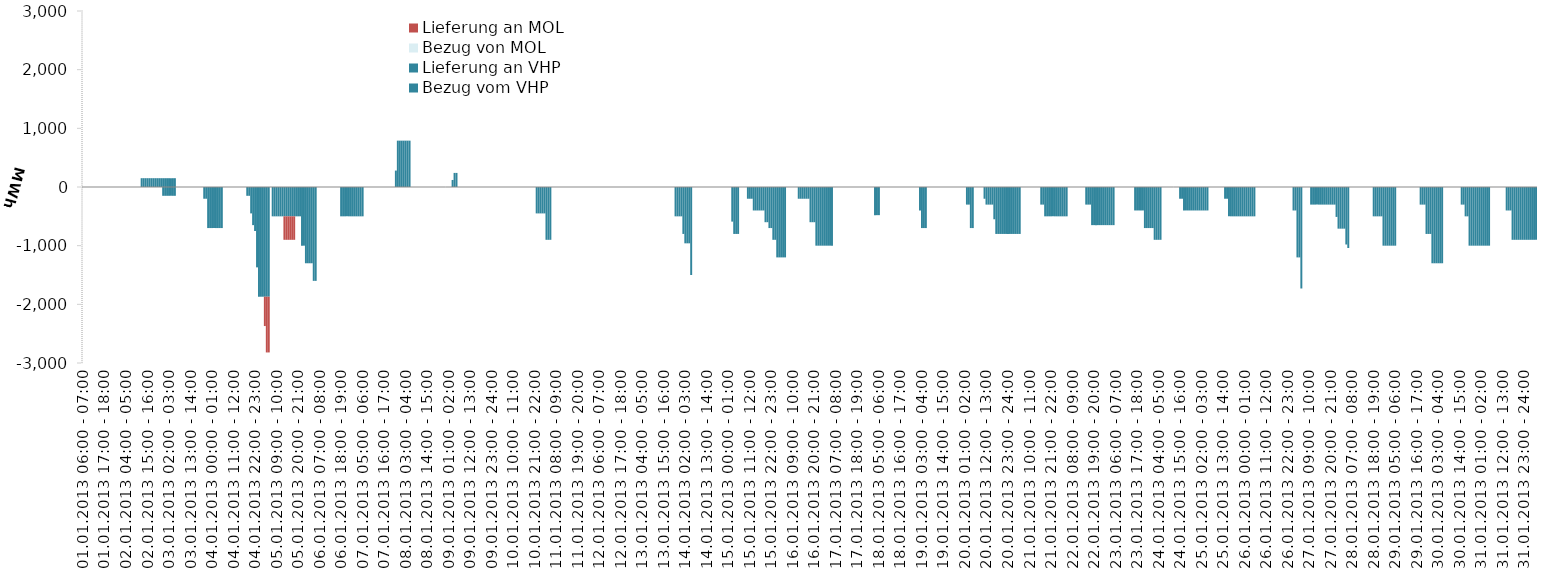
| Category | Bezug vom VHP | Lieferung an VHP | Bezug von MOL | Lieferung an MOL |
|---|---|---|---|---|
| 01.01.2013 06:00 - 07:00 | 0 | 0 | 0 | 0 |
| 01.01.2013 07:00 - 08:00 | 0 | 0 | 0 | 0 |
| 01.01.2013 08:00 - 09:00 | 0 | 0 | 0 | 0 |
| 01.01.2013 09:00 - 10:00 | 0 | 0 | 0 | 0 |
| 01.01.2013 10:00 - 11:00 | 0 | 0 | 0 | 0 |
| 01.01.2013 11:00 - 12:00 | 0 | 0 | 0 | 0 |
| 01.01.2013 12:00 - 13:00 | 0 | 0 | 0 | 0 |
| 01.01.2013 13:00 - 14:00 | 0 | 0 | 0 | 0 |
| 01.01.2013 14:00 - 15:00 | 0 | 0 | 0 | 0 |
| 01.01.2013 15:00 - 16:00 | 0 | 0 | 0 | 0 |
| 01.01.2013 16:00 - 17:00 | 0 | 0 | 0 | 0 |
| 01.01.2013 17:00 - 18:00 | 0 | 0 | 0 | 0 |
| 01.01.2013 18:00 - 19:00 | 0 | 0 | 0 | 0 |
| 01.01.2013 19:00 - 20:00 | 0 | 0 | 0 | 0 |
| 01.01.2013 20:00 - 21:00 | 0 | 0 | 0 | 0 |
| 01.01.2013 21:00 - 22:00 | 0 | 0 | 0 | 0 |
| 01.01.2013 22:00 - 23:00 | 0 | 0 | 0 | 0 |
| 01.01.2013 23:00 - 24:00 | 0 | 0 | 0 | 0 |
| 02.01.2013 00:00 - 01:00 | 0 | 0 | 0 | 0 |
| 02.01.2013 01:00 - 02:00 | 0 | 0 | 0 | 0 |
| 02.01.2013 02:00 - 03:00 | 0 | 0 | 0 | 0 |
| 02.01.2013 03:00 - 04:00 | 0 | 0 | 0 | 0 |
| 02.01.2013 04:00 - 05:00 | 0 | 0 | 0 | 0 |
| 02.01.2013 05:00 - 06:00 | 0 | 0 | 0 | 0 |
| 02.01.2013 06:00 - 07:00 | 0 | 0 | 0 | 0 |
| 02.01.2013 07:00 - 08:00 | 0 | 0 | 0 | 0 |
| 02.01.2013 08:00 - 09:00 | 0 | 0 | 0 | 0 |
| 02.01.2013 09:00 - 10:00 | 0 | 0 | 0 | 0 |
| 02.01.2013 10:00 - 11:00 | 0 | 0 | 0 | 0 |
| 02.01.2013 11:00 - 12:00 | 0 | 0 | 0 | 0 |
| 02.01.2013 12:00 - 13:00 | 150 | 0 | 0 | 0 |
| 02.01.2013 13:00 - 14:00 | 150 | 0 | 0 | 0 |
| 02.01.2013 14:00 - 15:00 | 150 | 0 | 0 | 0 |
| 02.01.2013 15:00 - 16:00 | 150 | 0 | 0 | 0 |
| 02.01.2013 16:00 - 17:00 | 150 | 0 | 0 | 0 |
| 02.01.2013 17:00 - 18:00 | 150 | 0 | 0 | 0 |
| 02.01.2013 18:00 - 19:00 | 150 | 0 | 0 | 0 |
| 02.01.2013 19:00 - 20:00 | 150 | 0 | 0 | 0 |
| 02.01.2013 20:00 - 21:00 | 150 | 0 | 0 | 0 |
| 02.01.2013 21:00 - 22:00 | 150 | 0 | 0 | 0 |
| 02.01.2013 22:00 - 23:00 | 150 | 0 | 0 | 0 |
| 02.01.2013 23:00 - 24:00 | 150 | -150 | 0 | 0 |
| 03.01.2013 00:00 - 01:00 | 150 | -150 | 0 | 0 |
| 03.01.2013 01:00 - 02:00 | 150 | -150 | 0 | 0 |
| 03.01.2013 02:00 - 03:00 | 150 | -150 | 0 | 0 |
| 03.01.2013 03:00 - 04:00 | 150 | -150 | 0 | 0 |
| 03.01.2013 04:00 - 05:00 | 150 | -150 | 0 | 0 |
| 03.01.2013 05:00 - 06:00 | 150 | -150 | 0 | 0 |
| 03.01.2013 06:00 - 07:00 | 0 | 0 | 0 | 0 |
| 03.01.2013 07:00 - 08:00 | 0 | 0 | 0 | 0 |
| 03.01.2013 08:00 - 09:00 | 0 | 0 | 0 | 0 |
| 03.01.2013 09:00 - 10:00 | 0 | 0 | 0 | 0 |
| 03.01.2013 10:00 - 11:00 | 0 | 0 | 0 | 0 |
| 03.01.2013 11:00 - 12:00 | 0 | 0 | 0 | 0 |
| 03.01.2013 12:00 - 13:00 | 0 | 0 | 0 | 0 |
| 03.01.2013 13:00 - 14:00 | 0 | 0 | 0 | 0 |
| 03.01.2013 14:00 - 15:00 | 0 | 0 | 0 | 0 |
| 03.01.2013 15:00 - 16:00 | 0 | 0 | 0 | 0 |
| 03.01.2013 16:00 - 17:00 | 0 | 0 | 0 | 0 |
| 03.01.2013 17:00 - 18:00 | 0 | 0 | 0 | 0 |
| 03.01.2013 18:00 - 19:00 | 0 | 0 | 0 | 0 |
| 03.01.2013 19:00 - 20:00 | 0 | 0 | 0 | 0 |
| 03.01.2013 20:00 - 21:00 | 0 | -200 | 0 | 0 |
| 03.01.2013 21:00 - 22:00 | 0 | -200 | 0 | 0 |
| 03.01.2013 22:00 - 23:00 | 0 | -700 | 0 | 0 |
| 03.01.2013 23:00 - 24:00 | 0 | -700 | 0 | 0 |
| 04.01.2013 00:00 - 01:00 | 0 | -700 | 0 | 0 |
| 04.01.2013 01:00 - 02:00 | 0 | -700 | 0 | 0 |
| 04.01.2013 02:00 - 03:00 | 0 | -700 | 0 | 0 |
| 04.01.2013 03:00 - 04:00 | 0 | -700 | 0 | 0 |
| 04.01.2013 04:00 - 05:00 | 0 | -700 | 0 | 0 |
| 04.01.2013 05:00 - 06:00 | 0 | -700 | 0 | 0 |
| 04.01.2013 06:00 - 07:00 | 0 | 0 | 0 | 0 |
| 04.01.2013 07:00 - 08:00 | 0 | 0 | 0 | 0 |
| 04.01.2013 08:00 - 09:00 | 0 | 0 | 0 | 0 |
| 04.01.2013 09:00 - 10:00 | 0 | 0 | 0 | 0 |
| 04.01.2013 10:00 - 11:00 | 0 | 0 | 0 | 0 |
| 04.01.2013 11:00 - 12:00 | 0 | 0 | 0 | 0 |
| 04.01.2013 12:00 - 13:00 | 0 | 0 | 0 | 0 |
| 04.01.2013 13:00 - 14:00 | 0 | 0 | 0 | 0 |
| 04.01.2013 14:00 - 15:00 | 0 | 0 | 0 | 0 |
| 04.01.2013 15:00 - 16:00 | 0 | 0 | 0 | 0 |
| 04.01.2013 16:00 - 17:00 | 0 | 0 | 0 | 0 |
| 04.01.2013 17:00 - 18:00 | 0 | 0 | 0 | 0 |
| 04.01.2013 18:00 - 19:00 | 0 | -150 | 0 | 0 |
| 04.01.2013 19:00 - 20:00 | 0 | -150 | 0 | 0 |
| 04.01.2013 20:00 - 21:00 | 0 | -450 | 0 | 0 |
| 04.01.2013 21:00 - 22:00 | 0 | -650 | 0 | 0 |
| 04.01.2013 22:00 - 23:00 | 0 | -750 | 0 | 0 |
| 04.01.2013 23:00 - 24:00 | 0 | -1370 | 0 | 0 |
| 05.01.2013 00:00 - 01:00 | 0 | -1870 | 0 | 0 |
| 05.01.2013 01:00 - 02:00 | 0 | -1870 | 0 | 0 |
| 05.01.2013 02:00 - 03:00 | 0 | -1870 | 0 | 0 |
| 05.01.2013 03:00 - 04:00 | 0 | -1870 | 0 | -500 |
| 05.01.2013 04:00 - 05:00 | 0 | -1870 | 0 | -950 |
| 05.01.2013 05:00 - 06:00 | 0 | -1870 | 0 | -950 |
| 05.01.2013 06:00 - 07:00 | 0 | 0 | 0 | 0 |
| 05.01.2013 07:00 - 08:00 | 0 | -500 | 0 | 0 |
| 05.01.2013 08:00 - 09:00 | 0 | -500 | 0 | 0 |
| 05.01.2013 09:00 - 10:00 | 0 | -500 | 0 | 0 |
| 05.01.2013 10:00 - 11:00 | 0 | -500 | 0 | 0 |
| 05.01.2013 11:00 - 12:00 | 0 | -500 | 0 | 0 |
| 05.01.2013 12:00 - 13:00 | 0 | -500 | 0 | 0 |
| 05.01.2013 13:00 - 14:00 | 0 | -500 | 0 | -400 |
| 05.01.2013 14:00 - 15:00 | 0 | -500 | 0 | -400 |
| 05.01.2013 15:00 - 16:00 | 0 | -500 | 0 | -400 |
| 05.01.2013 16:00 - 17:00 | 0 | -500 | 0 | -400 |
| 05.01.2013 17:00 - 18:00 | 0 | -500 | 0 | -400 |
| 05.01.2013 18:00 - 19:00 | 0 | -500 | 0 | -400 |
| 05.01.2013 19:00 - 20:00 | 0 | -500 | 0 | 0 |
| 05.01.2013 20:00 - 21:00 | 0 | -500 | 0 | 0 |
| 05.01.2013 21:00 - 22:00 | 0 | -500 | 0 | 0 |
| 05.01.2013 22:00 - 23:00 | 0 | -1000 | 0 | 0 |
| 05.01.2013 23:00 - 24:00 | 0 | -1000 | 0 | 0 |
| 06.01.2013 00:00 - 01:00 | 0 | -1300 | 0 | 0 |
| 06.01.2013 01:00 - 02:00 | 0 | -1300 | 0 | 0 |
| 06.01.2013 02:00 - 03:00 | 0 | -1300 | 0 | 0 |
| 06.01.2013 03:00 - 04:00 | 0 | -1300 | 0 | 0 |
| 06.01.2013 04:00 - 05:00 | 0 | -1600 | 0 | 0 |
| 06.01.2013 05:00 - 06:00 | 0 | -1600 | 0 | 0 |
| 06.01.2013 06:00 - 07:00 | 0 | 0 | 0 | 0 |
| 06.01.2013 07:00 - 08:00 | 0 | 0 | 0 | 0 |
| 06.01.2013 08:00 - 09:00 | 0 | 0 | 0 | 0 |
| 06.01.2013 09:00 - 10:00 | 0 | 0 | 0 | 0 |
| 06.01.2013 10:00 - 11:00 | 0 | 0 | 0 | 0 |
| 06.01.2013 11:00 - 12:00 | 0 | 0 | 0 | 0 |
| 06.01.2013 12:00 - 13:00 | 0 | 0 | 0 | 0 |
| 06.01.2013 13:00 - 14:00 | 0 | 0 | 0 | 0 |
| 06.01.2013 14:00 - 15:00 | 0 | 0 | 0 | 0 |
| 06.01.2013 15:00 - 16:00 | 0 | 0 | 0 | 0 |
| 06.01.2013 16:00 - 17:00 | 0 | 0 | 0 | 0 |
| 06.01.2013 17:00 - 18:00 | 0 | 0 | 0 | 0 |
| 06.01.2013 18:00 - 19:00 | 0 | -500 | 0 | 0 |
| 06.01.2013 19:00 - 20:00 | 0 | -500 | 0 | 0 |
| 06.01.2013 20:00 - 21:00 | 0 | -500 | 0 | 0 |
| 06.01.2013 21:00 - 22:00 | 0 | -500 | 0 | 0 |
| 06.01.2013 22:00 - 23:00 | 0 | -500 | 0 | 0 |
| 06.01.2013 23:00 - 24:00 | 0 | -500 | 0 | 0 |
| 07.01.2013 00:00 - 01:00 | 0 | -500 | 0 | 0 |
| 07.01.2013 01:00 - 02:00 | 0 | -500 | 0 | 0 |
| 07.01.2013 02:00 - 03:00 | 0 | -500 | 0 | 0 |
| 07.01.2013 03:00 - 04:00 | 0 | -500 | 0 | 0 |
| 07.01.2013 04:00 - 05:00 | 0 | -500 | 0 | 0 |
| 07.01.2013 05:00 - 06:00 | 0 | -500 | 0 | 0 |
| 07.01.2013 06:00 - 07:00 | 0 | 0 | 0 | 0 |
| 07.01.2013 07:00 - 08:00 | 0 | 0 | 0 | 0 |
| 07.01.2013 08:00 - 09:00 | 0 | 0 | 0 | 0 |
| 07.01.2013 09:00 - 10:00 | 0 | 0 | 0 | 0 |
| 07.01.2013 10:00 - 11:00 | 0 | 0 | 0 | 0 |
| 07.01.2013 11:00 - 12:00 | 0 | 0 | 0 | 0 |
| 07.01.2013 12:00 - 13:00 | 0 | 0 | 0 | 0 |
| 07.01.2013 13:00 - 14:00 | 0 | 0 | 0 | 0 |
| 07.01.2013 14:00 - 15:00 | 0 | 0 | 0 | 0 |
| 07.01.2013 15:00 - 16:00 | 0 | 0 | 0 | 0 |
| 07.01.2013 16:00 - 17:00 | 0 | 0 | 0 | 0 |
| 07.01.2013 17:00 - 18:00 | 0 | 0 | 0 | 0 |
| 07.01.2013 18:00 - 19:00 | 0 | 0 | 0 | 0 |
| 07.01.2013 19:00 - 20:00 | 0 | 0 | 0 | 0 |
| 07.01.2013 20:00 - 21:00 | 0 | 0 | 0 | 0 |
| 07.01.2013 21:00 - 22:00 | 0 | 0 | 0 | 0 |
| 07.01.2013 22:00 - 23:00 | 280 | 0 | 0 | 0 |
| 07.01.2013 23:00 - 24:00 | 790 | 0 | 0 | 0 |
| 08.01.2013 00:00 - 01:00 | 790 | 0 | 0 | 0 |
| 08.01.2013 01:00 - 02:00 | 790 | 0 | 0 | 0 |
| 08.01.2013 02:00 - 03:00 | 790 | 0 | 0 | 0 |
| 08.01.2013 03:00 - 04:00 | 790 | 0 | 0 | 0 |
| 08.01.2013 04:00 - 05:00 | 790 | 0 | 0 | 0 |
| 08.01.2013 05:00 - 06:00 | 790 | 0 | 0 | 0 |
| 08.01.2013 06:00 - 07:00 | 0 | 0 | 0 | 0 |
| 08.01.2013 07:00 - 08:00 | 0 | 0 | 0 | 0 |
| 08.01.2013 08:00 - 09:00 | 0 | 0 | 0 | 0 |
| 08.01.2013 09:00 - 10:00 | 0 | 0 | 0 | 0 |
| 08.01.2013 10:00 - 11:00 | 0 | 0 | 0 | 0 |
| 08.01.2013 11:00 - 12:00 | 0 | 0 | 0 | 0 |
| 08.01.2013 12:00 - 13:00 | 0 | 0 | 0 | 0 |
| 08.01.2013 13:00 - 14:00 | 0 | 0 | 0 | 0 |
| 08.01.2013 14:00 - 15:00 | 0 | 0 | 0 | 0 |
| 08.01.2013 15:00 - 16:00 | 0 | 0 | 0 | 0 |
| 08.01.2013 16:00 - 17:00 | 0 | 0 | 0 | 0 |
| 08.01.2013 17:00 - 18:00 | 0 | 0 | 0 | 0 |
| 08.01.2013 18:00 - 19:00 | 0 | 0 | 0 | 0 |
| 08.01.2013 19:00 - 20:00 | 0 | 0 | 0 | 0 |
| 08.01.2013 20:00 - 21:00 | 0 | 0 | 0 | 0 |
| 08.01.2013 21:00 - 22:00 | 0 | 0 | 0 | 0 |
| 08.01.2013 22:00 - 23:00 | 0 | 0 | 0 | 0 |
| 08.01.2013 23:00 - 24:00 | 0 | 0 | 0 | 0 |
| 09.01.2013 00:00 - 01:00 | 0 | 0 | 0 | 0 |
| 09.01.2013 01:00 - 02:00 | 0 | 0 | 0 | 0 |
| 09.01.2013 02:00 - 03:00 | 0 | 0 | 0 | 0 |
| 09.01.2013 03:00 - 04:00 | 120 | 0 | 0 | 0 |
| 09.01.2013 04:00 - 05:00 | 240 | 0 | 0 | 0 |
| 09.01.2013 05:00 - 06:00 | 240 | 0 | 0 | 0 |
| 09.01.2013 06:00 - 07:00 | 0 | 0 | 0 | 0 |
| 09.01.2013 07:00 - 08:00 | 0 | 0 | 0 | 0 |
| 09.01.2013 08:00 - 09:00 | 0 | 0 | 0 | 0 |
| 09.01.2013 09:00 - 10:00 | 0 | 0 | 0 | 0 |
| 09.01.2013 10:00 - 11:00 | 0 | 0 | 0 | 0 |
| 09.01.2013 11:00 - 12:00 | 0 | 0 | 0 | 0 |
| 09.01.2013 12:00 - 13:00 | 0 | 0 | 0 | 0 |
| 09.01.2013 13:00 - 14:00 | 0 | 0 | 0 | 0 |
| 09.01.2013 14:00 - 15:00 | 0 | 0 | 0 | 0 |
| 09.01.2013 15:00 - 16:00 | 0 | 0 | 0 | 0 |
| 09.01.2013 16:00 - 17:00 | 0 | 0 | 0 | 0 |
| 09.01.2013 17:00 - 18:00 | 0 | 0 | 0 | 0 |
| 09.01.2013 18:00 - 19:00 | 0 | 0 | 0 | 0 |
| 09.01.2013 19:00 - 20:00 | 0 | 0 | 0 | 0 |
| 09.01.2013 20:00 - 21:00 | 0 | 0 | 0 | 0 |
| 09.01.2013 21:00 - 22:00 | 0 | 0 | 0 | 0 |
| 09.01.2013 22:00 - 23:00 | 0 | 0 | 0 | 0 |
| 09.01.2013 23:00 - 24:00 | 0 | 0 | 0 | 0 |
| 10.01.2013 00:00 - 01:00 | 0 | 0 | 0 | 0 |
| 10.01.2013 01:00 - 02:00 | 0 | 0 | 0 | 0 |
| 10.01.2013 02:00 - 03:00 | 0 | 0 | 0 | 0 |
| 10.01.2013 03:00 - 04:00 | 0 | 0 | 0 | 0 |
| 10.01.2013 04:00 - 05:00 | 0 | 0 | 0 | 0 |
| 10.01.2013 05:00 - 06:00 | 0 | 0 | 0 | 0 |
| 10.01.2013 06:00 - 07:00 | 0 | 0 | 0 | 0 |
| 10.01.2013 07:00 - 08:00 | 0 | 0 | 0 | 0 |
| 10.01.2013 08:00 - 09:00 | 0 | 0 | 0 | 0 |
| 10.01.2013 09:00 - 10:00 | 0 | 0 | 0 | 0 |
| 10.01.2013 10:00 - 11:00 | 0 | 0 | 0 | 0 |
| 10.01.2013 11:00 - 12:00 | 0 | 0 | 0 | 0 |
| 10.01.2013 12:00 - 13:00 | 0 | 0 | 0 | 0 |
| 10.01.2013 13:00 - 14:00 | 0 | 0 | 0 | 0 |
| 10.01.2013 14:00 - 15:00 | 0 | 0 | 0 | 0 |
| 10.01.2013 15:00 - 16:00 | 0 | 0 | 0 | 0 |
| 10.01.2013 16:00 - 17:00 | 0 | 0 | 0 | 0 |
| 10.01.2013 17:00 - 18:00 | 0 | 0 | 0 | 0 |
| 10.01.2013 18:00 - 19:00 | 0 | 0 | 0 | 0 |
| 10.01.2013 19:00 - 20:00 | 0 | 0 | 0 | 0 |
| 10.01.2013 20:00 - 21:00 | 0 | 0 | 0 | 0 |
| 10.01.2013 21:00 - 22:00 | 0 | 0 | 0 | 0 |
| 10.01.2013 22:00 - 23:00 | 0 | -450 | 0 | 0 |
| 10.01.2013 23:00 - 24:00 | 0 | -450 | 0 | 0 |
| 11.01.2013 00:00 - 01:00 | 0 | -450 | 0 | 0 |
| 11.01.2013 01:00 - 02:00 | 0 | -450 | 0 | 0 |
| 11.01.2013 02:00 - 03:00 | 0 | -450 | 0 | 0 |
| 11.01.2013 03:00 - 04:00 | 0 | -900 | 0 | 0 |
| 11.01.2013 04:00 - 05:00 | 0 | -900 | 0 | 0 |
| 11.01.2013 05:00 - 06:00 | 0 | -900 | 0 | 0 |
| 11.01.2013 06:00 - 07:00 | 0 | 0 | 0 | 0 |
| 11.01.2013 07:00 - 08:00 | 0 | 0 | 0 | 0 |
| 11.01.2013 08:00 - 09:00 | 0 | 0 | 0 | 0 |
| 11.01.2013 09:00 - 10:00 | 0 | 0 | 0 | 0 |
| 11.01.2013 10:00 - 11:00 | 0 | 0 | 0 | 0 |
| 11.01.2013 11:00 - 12:00 | 0 | 0 | 0 | 0 |
| 11.01.2013 12:00 - 13:00 | 0 | 0 | 0 | 0 |
| 11.01.2013 13:00 - 14:00 | 0 | 0 | 0 | 0 |
| 11.01.2013 14:00 - 15:00 | 0 | 0 | 0 | 0 |
| 11.01.2013 15:00 - 16:00 | 0 | 0 | 0 | 0 |
| 11.01.2013 16:00 - 17:00 | 0 | 0 | 0 | 0 |
| 11.01.2013 17:00 - 18:00 | 0 | 0 | 0 | 0 |
| 11.01.2013 18:00 - 19:00 | 0 | 0 | 0 | 0 |
| 11.01.2013 19:00 - 20:00 | 0 | 0 | 0 | 0 |
| 11.01.2013 20:00 - 21:00 | 0 | 0 | 0 | 0 |
| 11.01.2013 21:00 - 22:00 | 0 | 0 | 0 | 0 |
| 11.01.2013 22:00 - 23:00 | 0 | 0 | 0 | 0 |
| 11.01.2013 23:00 - 24:00 | 0 | 0 | 0 | 0 |
| 12.01.2013 00:00 - 01:00 | 0 | 0 | 0 | 0 |
| 12.01.2013 01:00 - 02:00 | 0 | 0 | 0 | 0 |
| 12.01.2013 02:00 - 03:00 | 0 | 0 | 0 | 0 |
| 12.01.2013 03:00 - 04:00 | 0 | 0 | 0 | 0 |
| 12.01.2013 04:00 - 05:00 | 0 | 0 | 0 | 0 |
| 12.01.2013 05:00 - 06:00 | 0 | 0 | 0 | 0 |
| 12.01.2013 06:00 - 07:00 | 0 | 0 | 0 | 0 |
| 12.01.2013 07:00 - 08:00 | 0 | 0 | 0 | 0 |
| 12.01.2013 08:00 - 09:00 | 0 | 0 | 0 | 0 |
| 12.01.2013 09:00 - 10:00 | 0 | 0 | 0 | 0 |
| 12.01.2013 10:00 - 11:00 | 0 | 0 | 0 | 0 |
| 12.01.2013 11:00 - 12:00 | 0 | 0 | 0 | 0 |
| 12.01.2013 12:00 - 13:00 | 0 | 0 | 0 | 0 |
| 12.01.2013 13:00 - 14:00 | 0 | 0 | 0 | 0 |
| 12.01.2013 14:00 - 15:00 | 0 | 0 | 0 | 0 |
| 12.01.2013 15:00 - 16:00 | 0 | 0 | 0 | 0 |
| 12.01.2013 16:00 - 17:00 | 0 | 0 | 0 | 0 |
| 12.01.2013 17:00 - 18:00 | 0 | 0 | 0 | 0 |
| 12.01.2013 18:00 - 19:00 | 0 | 0 | 0 | 0 |
| 12.01.2013 19:00 - 20:00 | 0 | 0 | 0 | 0 |
| 12.01.2013 20:00 - 21:00 | 0 | 0 | 0 | 0 |
| 12.01.2013 21:00 - 22:00 | 0 | 0 | 0 | 0 |
| 12.01.2013 22:00 - 23:00 | 0 | 0 | 0 | 0 |
| 12.01.2013 23:00 - 24:00 | 0 | 0 | 0 | 0 |
| 13.01.2013 00:00 - 01:00 | 0 | 0 | 0 | 0 |
| 13.01.2013 01:00 - 02:00 | 0 | 0 | 0 | 0 |
| 13.01.2013 02:00 - 03:00 | 0 | 0 | 0 | 0 |
| 13.01.2013 03:00 - 04:00 | 0 | 0 | 0 | 0 |
| 13.01.2013 04:00 - 05:00 | 0 | 0 | 0 | 0 |
| 13.01.2013 05:00 - 06:00 | 0 | 0 | 0 | 0 |
| 13.01.2013 06:00 - 07:00 | 0 | 0 | 0 | 0 |
| 13.01.2013 07:00 - 08:00 | 0 | 0 | 0 | 0 |
| 13.01.2013 08:00 - 09:00 | 0 | 0 | 0 | 0 |
| 13.01.2013 09:00 - 10:00 | 0 | 0 | 0 | 0 |
| 13.01.2013 10:00 - 11:00 | 0 | 0 | 0 | 0 |
| 13.01.2013 11:00 - 12:00 | 0 | 0 | 0 | 0 |
| 13.01.2013 12:00 - 13:00 | 0 | 0 | 0 | 0 |
| 13.01.2013 13:00 - 14:00 | 0 | 0 | 0 | 0 |
| 13.01.2013 14:00 - 15:00 | 0 | 0 | 0 | 0 |
| 13.01.2013 15:00 - 16:00 | 0 | 0 | 0 | 0 |
| 13.01.2013 16:00 - 17:00 | 0 | 0 | 0 | 0 |
| 13.01.2013 17:00 - 18:00 | 0 | 0 | 0 | 0 |
| 13.01.2013 18:00 - 19:00 | 0 | 0 | 0 | 0 |
| 13.01.2013 19:00 - 20:00 | 0 | 0 | 0 | 0 |
| 13.01.2013 20:00 - 21:00 | 0 | 0 | 0 | 0 |
| 13.01.2013 21:00 - 22:00 | 0 | -500 | 0 | 0 |
| 13.01.2013 22:00 - 23:00 | 0 | -500 | 0 | 0 |
| 13.01.2013 23:00 - 24:00 | 0 | -500 | 0 | 0 |
| 14.01.2013 00:00 - 01:00 | 0 | -500 | 0 | 0 |
| 14.01.2013 01:00 - 02:00 | 0 | -800 | 0 | 0 |
| 14.01.2013 02:00 - 03:00 | 0 | -960 | 0 | 0 |
| 14.01.2013 03:00 - 04:00 | 0 | -960 | 0 | 0 |
| 14.01.2013 04:00 - 05:00 | 0 | -960 | 0 | 0 |
| 14.01.2013 05:00 - 06:00 | 0 | -1500 | 0 | 0 |
| 14.01.2013 06:00 - 07:00 | 0 | 0 | 0 | 0 |
| 14.01.2013 07:00 - 08:00 | 0 | 0 | 0 | 0 |
| 14.01.2013 08:00 - 09:00 | 0 | 0 | 0 | 0 |
| 14.01.2013 09:00 - 10:00 | 0 | 0 | 0 | 0 |
| 14.01.2013 10:00 - 11:00 | 0 | 0 | 0 | 0 |
| 14.01.2013 11:00 - 12:00 | 0 | 0 | 0 | 0 |
| 14.01.2013 12:00 - 13:00 | 0 | 0 | 0 | 0 |
| 14.01.2013 13:00 - 14:00 | 0 | 0 | 0 | 0 |
| 14.01.2013 14:00 - 15:00 | 0 | 0 | 0 | 0 |
| 14.01.2013 15:00 - 16:00 | 0 | 0 | 0 | 0 |
| 14.01.2013 16:00 - 17:00 | 0 | 0 | 0 | 0 |
| 14.01.2013 17:00 - 18:00 | 0 | 0 | 0 | 0 |
| 14.01.2013 18:00 - 19:00 | 0 | 0 | 0 | 0 |
| 14.01.2013 19:00 - 20:00 | 0 | 0 | 0 | 0 |
| 14.01.2013 20:00 - 21:00 | 0 | 0 | 0 | 0 |
| 14.01.2013 21:00 - 22:00 | 0 | 0 | 0 | 0 |
| 14.01.2013 22:00 - 23:00 | 0 | 0 | 0 | 0 |
| 14.01.2013 23:00 - 24:00 | 0 | 0 | 0 | 0 |
| 15.01.2013 00:00 - 01:00 | 0 | 0 | 0 | 0 |
| 15.01.2013 01:00 - 02:00 | 0 | 0 | 0 | 0 |
| 15.01.2013 02:00 - 03:00 | 0 | -590 | 0 | 0 |
| 15.01.2013 03:00 - 04:00 | 0 | -800 | 0 | 0 |
| 15.01.2013 04:00 - 05:00 | 0 | -800 | 0 | 0 |
| 15.01.2013 05:00 - 06:00 | 0 | -800 | 0 | 0 |
| 15.01.2013 06:00 - 07:00 | 0 | 0 | 0 | 0 |
| 15.01.2013 07:00 - 08:00 | 0 | 0 | 0 | 0 |
| 15.01.2013 08:00 - 09:00 | 0 | 0 | 0 | 0 |
| 15.01.2013 09:00 - 10:00 | 0 | 0 | 0 | 0 |
| 15.01.2013 10:00 - 11:00 | 0 | -200 | 0 | 0 |
| 15.01.2013 11:00 - 12:00 | 0 | -200 | 0 | 0 |
| 15.01.2013 12:00 - 13:00 | 0 | -200 | 0 | 0 |
| 15.01.2013 13:00 - 14:00 | 0 | -400 | 0 | 0 |
| 15.01.2013 14:00 - 15:00 | 0 | -400 | 0 | 0 |
| 15.01.2013 15:00 - 16:00 | 0 | -400 | 0 | 0 |
| 15.01.2013 16:00 - 17:00 | 0 | -400 | 0 | 0 |
| 15.01.2013 17:00 - 18:00 | 0 | -400 | 0 | 0 |
| 15.01.2013 18:00 - 19:00 | 0 | -400 | 0 | 0 |
| 15.01.2013 19:00 - 20:00 | 0 | -600 | 0 | 0 |
| 15.01.2013 20:00 - 21:00 | 0 | -600 | 0 | 0 |
| 15.01.2013 21:00 - 22:00 | 0 | -700 | 0 | 0 |
| 15.01.2013 22:00 - 23:00 | 0 | -700 | 0 | 0 |
| 15.01.2013 23:00 - 24:00 | 0 | -900 | 0 | 0 |
| 16.01.2013 00:00 - 01:00 | 0 | -900 | 0 | 0 |
| 16.01.2013 01:00 - 02:00 | 0 | -1200 | 0 | 0 |
| 16.01.2013 02:00 - 03:00 | 0 | -1200 | 0 | 0 |
| 16.01.2013 03:00 - 04:00 | 0 | -1200 | 0 | 0 |
| 16.01.2013 04:00 - 05:00 | 0 | -1200 | 0 | 0 |
| 16.01.2013 05:00 - 06:00 | 0 | -1200 | 0 | 0 |
| 16.01.2013 06:00 - 07:00 | 0 | 0 | 0 | 0 |
| 16.01.2013 07:00 - 08:00 | 0 | 0 | 0 | 0 |
| 16.01.2013 08:00 - 09:00 | 0 | 0 | 0 | 0 |
| 16.01.2013 09:00 - 10:00 | 0 | 0 | 0 | 0 |
| 16.01.2013 10:00 - 11:00 | 0 | 0 | 0 | 0 |
| 16.01.2013 11:00 - 12:00 | 0 | 0 | 0 | 0 |
| 16.01.2013 12:00 - 13:00 | 0 | -200 | 0 | 0 |
| 16.01.2013 13:00 - 14:00 | 0 | -200 | 0 | 0 |
| 16.01.2013 14:00 - 15:00 | 0 | -200 | 0 | 0 |
| 16.01.2013 15:00 - 16:00 | 0 | -200 | 0 | 0 |
| 16.01.2013 16:00 - 17:00 | 0 | -200 | 0 | 0 |
| 16.01.2013 17:00 - 18:00 | 0 | -200 | 0 | 0 |
| 16.01.2013 18:00 - 19:00 | 0 | -600 | 0 | 0 |
| 16.01.2013 19:00 - 20:00 | 0 | -600 | 0 | 0 |
| 16.01.2013 20:00 - 21:00 | 0 | -600 | 0 | 0 |
| 16.01.2013 21:00 - 22:00 | 0 | -1000 | 0 | 0 |
| 16.01.2013 22:00 - 23:00 | 0 | -1000 | 0 | 0 |
| 16.01.2013 23:00 - 24:00 | 0 | -1000 | 0 | 0 |
| 17.01.2013 00:00 - 01:00 | 0 | -1000 | 0 | 0 |
| 17.01.2013 01:00 - 02:00 | 0 | -1000 | 0 | 0 |
| 17.01.2013 02:00 - 03:00 | 0 | -1000 | 0 | 0 |
| 17.01.2013 03:00 - 04:00 | 0 | -1000 | 0 | 0 |
| 17.01.2013 04:00 - 05:00 | 0 | -1000 | 0 | 0 |
| 17.01.2013 05:00 - 06:00 | 0 | -1000 | 0 | 0 |
| 17.01.2013 06:00 - 07:00 | 0 | 0 | 0 | 0 |
| 17.01.2013 07:00 - 08:00 | 0 | 0 | 0 | 0 |
| 17.01.2013 08:00 - 09:00 | 0 | 0 | 0 | 0 |
| 17.01.2013 09:00 - 10:00 | 0 | 0 | 0 | 0 |
| 17.01.2013 10:00 - 11:00 | 0 | 0 | 0 | 0 |
| 17.01.2013 11:00 - 12:00 | 0 | 0 | 0 | 0 |
| 17.01.2013 12:00 - 13:00 | 0 | 0 | 0 | 0 |
| 17.01.2013 13:00 - 14:00 | 0 | 0 | 0 | 0 |
| 17.01.2013 14:00 - 15:00 | 0 | 0 | 0 | 0 |
| 17.01.2013 15:00 - 16:00 | 0 | 0 | 0 | 0 |
| 17.01.2013 16:00 - 17:00 | 0 | 0 | 0 | 0 |
| 17.01.2013 17:00 - 18:00 | 0 | 0 | 0 | 0 |
| 17.01.2013 18:00 - 19:00 | 0 | 0 | 0 | 0 |
| 17.01.2013 19:00 - 20:00 | 0 | 0 | 0 | 0 |
| 17.01.2013 20:00 - 21:00 | 0 | 0 | 0 | 0 |
| 17.01.2013 21:00 - 22:00 | 0 | 0 | 0 | 0 |
| 17.01.2013 22:00 - 23:00 | 0 | 0 | 0 | 0 |
| 17.01.2013 23:00 - 24:00 | 0 | 0 | 0 | 0 |
| 18.01.2013 00:00 - 01:00 | 0 | 0 | 0 | 0 |
| 18.01.2013 01:00 - 02:00 | 0 | 0 | 0 | 0 |
| 18.01.2013 02:00 - 03:00 | 0 | 0 | 0 | 0 |
| 18.01.2013 03:00 - 04:00 | 0 | -480 | 0 | 0 |
| 18.01.2013 04:00 - 05:00 | 0 | -480 | 0 | 0 |
| 18.01.2013 05:00 - 06:00 | 0 | -480 | 0 | 0 |
| 18.01.2013 06:00 - 07:00 | 0 | 0 | 0 | 0 |
| 18.01.2013 07:00 - 08:00 | 0 | 0 | 0 | 0 |
| 18.01.2013 08:00 - 09:00 | 0 | 0 | 0 | 0 |
| 18.01.2013 09:00 - 10:00 | 0 | 0 | 0 | 0 |
| 18.01.2013 10:00 - 11:00 | 0 | 0 | 0 | 0 |
| 18.01.2013 11:00 - 12:00 | 0 | 0 | 0 | 0 |
| 18.01.2013 12:00 - 13:00 | 0 | 0 | 0 | 0 |
| 18.01.2013 13:00 - 14:00 | 0 | 0 | 0 | 0 |
| 18.01.2013 14:00 - 15:00 | 0 | 0 | 0 | 0 |
| 18.01.2013 15:00 - 16:00 | 0 | 0 | 0 | 0 |
| 18.01.2013 16:00 - 17:00 | 0 | 0 | 0 | 0 |
| 18.01.2013 17:00 - 18:00 | 0 | 0 | 0 | 0 |
| 18.01.2013 18:00 - 19:00 | 0 | 0 | 0 | 0 |
| 18.01.2013 19:00 - 20:00 | 0 | 0 | 0 | 0 |
| 18.01.2013 20:00 - 21:00 | 0 | 0 | 0 | 0 |
| 18.01.2013 21:00 - 22:00 | 0 | 0 | 0 | 0 |
| 18.01.2013 22:00 - 23:00 | 0 | 0 | 0 | 0 |
| 18.01.2013 23:00 - 24:00 | 0 | 0 | 0 | 0 |
| 19.01.2013 00:00 - 01:00 | 0 | 0 | 0 | 0 |
| 19.01.2013 01:00 - 02:00 | 0 | 0 | 0 | 0 |
| 19.01.2013 02:00 - 03:00 | 0 | -400 | 0 | 0 |
| 19.01.2013 03:00 - 04:00 | 0 | -700 | 0 | 0 |
| 19.01.2013 04:00 - 05:00 | 0 | -700 | 0 | 0 |
| 19.01.2013 05:00 - 06:00 | 0 | -700 | 0 | 0 |
| 19.01.2013 06:00 - 07:00 | 0 | 0 | 0 | 0 |
| 19.01.2013 07:00 - 08:00 | 0 | 0 | 0 | 0 |
| 19.01.2013 08:00 - 09:00 | 0 | 0 | 0 | 0 |
| 19.01.2013 09:00 - 10:00 | 0 | 0 | 0 | 0 |
| 19.01.2013 10:00 - 11:00 | 0 | 0 | 0 | 0 |
| 19.01.2013 11:00 - 12:00 | 0 | 0 | 0 | 0 |
| 19.01.2013 12:00 - 13:00 | 0 | 0 | 0 | 0 |
| 19.01.2013 13:00 - 14:00 | 0 | 0 | 0 | 0 |
| 19.01.2013 14:00 - 15:00 | 0 | 0 | 0 | 0 |
| 19.01.2013 15:00 - 16:00 | 0 | 0 | 0 | 0 |
| 19.01.2013 16:00 - 17:00 | 0 | 0 | 0 | 0 |
| 19.01.2013 17:00 - 18:00 | 0 | 0 | 0 | 0 |
| 19.01.2013 18:00 - 19:00 | 0 | 0 | 0 | 0 |
| 19.01.2013 19:00 - 20:00 | 0 | 0 | 0 | 0 |
| 19.01.2013 20:00 - 21:00 | 0 | 0 | 0 | 0 |
| 19.01.2013 21:00 - 22:00 | 0 | 0 | 0 | 0 |
| 19.01.2013 22:00 - 23:00 | 0 | 0 | 0 | 0 |
| 19.01.2013 23:00 - 24:00 | 0 | 0 | 0 | 0 |
| 20.01.2013 00:00 - 01:00 | 0 | 0 | 0 | 0 |
| 20.01.2013 01:00 - 02:00 | 0 | 0 | 0 | 0 |
| 20.01.2013 02:00 - 03:00 | 0 | -300 | 0 | 0 |
| 20.01.2013 03:00 - 04:00 | 0 | -300 | 0 | 0 |
| 20.01.2013 04:00 - 05:00 | 0 | -700 | 0 | 0 |
| 20.01.2013 05:00 - 06:00 | 0 | -700 | 0 | 0 |
| 20.01.2013 06:00 - 07:00 | 0 | 0 | 0 | 0 |
| 20.01.2013 07:00 - 08:00 | 0 | 0 | 0 | 0 |
| 20.01.2013 08:00 - 09:00 | 0 | 0 | 0 | 0 |
| 20.01.2013 09:00 - 10:00 | 0 | 0 | 0 | 0 |
| 20.01.2013 10:00 - 11:00 | 0 | 0 | 0 | 0 |
| 20.01.2013 11:00 - 12:00 | 0 | -200 | 0 | 0 |
| 20.01.2013 12:00 - 13:00 | 0 | -300 | 0 | 0 |
| 20.01.2013 13:00 - 14:00 | 0 | -300 | 0 | 0 |
| 20.01.2013 14:00 - 15:00 | 0 | -300 | 0 | 0 |
| 20.01.2013 15:00 - 16:00 | 0 | -300 | 0 | 0 |
| 20.01.2013 16:00 - 17:00 | 0 | -550 | 0 | 0 |
| 20.01.2013 17:00 - 18:00 | 0 | -800 | 0 | 0 |
| 20.01.2013 18:00 - 19:00 | 0 | -800 | 0 | 0 |
| 20.01.2013 19:00 - 20:00 | 0 | -800 | 0 | 0 |
| 20.01.2013 20:00 - 21:00 | 0 | -800 | 0 | 0 |
| 20.01.2013 21:00 - 22:00 | 0 | -800 | 0 | 0 |
| 20.01.2013 22:00 - 23:00 | 0 | -800 | 0 | 0 |
| 20.01.2013 23:00 - 24:00 | 0 | -800 | 0 | 0 |
| 21.01.2013 00:00 - 01:00 | 0 | -800 | 0 | 0 |
| 21.01.2013 01:00 - 02:00 | 0 | -800 | 0 | 0 |
| 21.01.2013 02:00 - 03:00 | 0 | -800 | 0 | 0 |
| 21.01.2013 03:00 - 04:00 | 0 | -800 | 0 | 0 |
| 21.01.2013 04:00 - 05:00 | 0 | -800 | 0 | 0 |
| 21.01.2013 05:00 - 06:00 | 0 | -800 | 0 | 0 |
| 21.01.2013 06:00 - 07:00 | 0 | 0 | 0 | 0 |
| 21.01.2013 07:00 - 08:00 | 0 | 0 | 0 | 0 |
| 21.01.2013 08:00 - 09:00 | 0 | 0 | 0 | 0 |
| 21.01.2013 09:00 - 10:00 | 0 | 0 | 0 | 0 |
| 21.01.2013 10:00 - 11:00 | 0 | 0 | 0 | 0 |
| 21.01.2013 11:00 - 12:00 | 0 | 0 | 0 | 0 |
| 21.01.2013 12:00 - 13:00 | 0 | 0 | 0 | 0 |
| 21.01.2013 13:00 - 14:00 | 0 | 0 | 0 | 0 |
| 21.01.2013 14:00 - 15:00 | 0 | 0 | 0 | 0 |
| 21.01.2013 15:00 - 16:00 | 0 | 0 | 0 | 0 |
| 21.01.2013 16:00 - 17:00 | 0 | -300 | 0 | 0 |
| 21.01.2013 17:00 - 18:00 | 0 | -300 | 0 | 0 |
| 21.01.2013 18:00 - 19:00 | 0 | -500 | 0 | 0 |
| 21.01.2013 19:00 - 20:00 | 0 | -500 | 0 | 0 |
| 21.01.2013 20:00 - 21:00 | 0 | -500 | 0 | 0 |
| 21.01.2013 21:00 - 22:00 | 0 | -500 | 0 | 0 |
| 21.01.2013 22:00 - 23:00 | 0 | -500 | 0 | 0 |
| 21.01.2013 23:00 - 24:00 | 0 | -500 | 0 | 0 |
| 22.01.2013 00:00 - 01:00 | 0 | -500 | 0 | 0 |
| 22.01.2013 01:00 - 02:00 | 0 | -500 | 0 | 0 |
| 22.01.2013 02:00 - 03:00 | 0 | -500 | 0 | 0 |
| 22.01.2013 03:00 - 04:00 | 0 | -500 | 0 | 0 |
| 22.01.2013 04:00 - 05:00 | 0 | -500 | 0 | 0 |
| 22.01.2013 05:00 - 06:00 | 0 | -500 | 0 | 0 |
| 22.01.2013 06:00 - 07:00 | 0 | 0 | 0 | 0 |
| 22.01.2013 07:00 - 08:00 | 0 | 0 | 0 | 0 |
| 22.01.2013 08:00 - 09:00 | 0 | 0 | 0 | 0 |
| 22.01.2013 09:00 - 10:00 | 0 | 0 | 0 | 0 |
| 22.01.2013 10:00 - 11:00 | 0 | 0 | 0 | 0 |
| 22.01.2013 11:00 - 12:00 | 0 | 0 | 0 | 0 |
| 22.01.2013 12:00 - 13:00 | 0 | 0 | 0 | 0 |
| 22.01.2013 13:00 - 14:00 | 0 | 0 | 0 | 0 |
| 22.01.2013 14:00 - 15:00 | 0 | 0 | 0 | 0 |
| 22.01.2013 15:00 - 16:00 | 0 | -300 | 0 | 0 |
| 22.01.2013 16:00 - 17:00 | 0 | -300 | 0 | 0 |
| 22.01.2013 17:00 - 18:00 | 0 | -300 | 0 | 0 |
| 22.01.2013 18:00 - 19:00 | 0 | -650 | 0 | 0 |
| 22.01.2013 19:00 - 20:00 | 0 | -650 | 0 | 0 |
| 22.01.2013 20:00 - 21:00 | 0 | -650 | 0 | 0 |
| 22.01.2013 21:00 - 22:00 | 0 | -650 | 0 | 0 |
| 22.01.2013 22:00 - 23:00 | 0 | -650 | 0 | 0 |
| 22.01.2013 23:00 - 24:00 | 0 | -650 | 0 | 0 |
| 23.01.2013 00:00 - 01:00 | 0 | -650 | 0 | 0 |
| 23.01.2013 01:00 - 02:00 | 0 | -650 | 0 | 0 |
| 23.01.2013 02:00 - 03:00 | 0 | -650 | 0 | 0 |
| 23.01.2013 03:00 - 04:00 | 0 | -650 | 0 | 0 |
| 23.01.2013 04:00 - 05:00 | 0 | -650 | 0 | 0 |
| 23.01.2013 05:00 - 06:00 | 0 | -650 | 0 | 0 |
| 23.01.2013 06:00 - 07:00 | 0 | 0 | 0 | 0 |
| 23.01.2013 07:00 - 08:00 | 0 | 0 | 0 | 0 |
| 23.01.2013 08:00 - 09:00 | 0 | 0 | 0 | 0 |
| 23.01.2013 09:00 - 10:00 | 0 | 0 | 0 | 0 |
| 23.01.2013 10:00 - 11:00 | 0 | 0 | 0 | 0 |
| 23.01.2013 11:00 - 12:00 | 0 | 0 | 0 | 0 |
| 23.01.2013 12:00 - 13:00 | 0 | 0 | 0 | 0 |
| 23.01.2013 13:00 - 14:00 | 0 | 0 | 0 | 0 |
| 23.01.2013 14:00 - 15:00 | 0 | 0 | 0 | 0 |
| 23.01.2013 15:00 - 16:00 | 0 | 0 | 0 | 0 |
| 23.01.2013 16:00 - 17:00 | 0 | -400 | 0 | 0 |
| 23.01.2013 17:00 - 18:00 | 0 | -400 | 0 | 0 |
| 23.01.2013 18:00 - 19:00 | 0 | -400 | 0 | 0 |
| 23.01.2013 19:00 - 20:00 | 0 | -400 | 0 | 0 |
| 23.01.2013 20:00 - 21:00 | 0 | -400 | 0 | 0 |
| 23.01.2013 21:00 - 22:00 | 0 | -700 | 0 | 0 |
| 23.01.2013 22:00 - 23:00 | 0 | -700 | 0 | 0 |
| 23.01.2013 23:00 - 24:00 | 0 | -700 | 0 | 0 |
| 24.01.2013 00:00 - 01:00 | 0 | -700 | 0 | 0 |
| 24.01.2013 01:00 - 02:00 | 0 | -700 | 0 | 0 |
| 24.01.2013 02:00 - 03:00 | 0 | -900 | 0 | 0 |
| 24.01.2013 03:00 - 04:00 | 0 | -900 | 0 | 0 |
| 24.01.2013 04:00 - 05:00 | 0 | -900 | 0 | 0 |
| 24.01.2013 05:00 - 06:00 | 0 | -900 | 0 | 0 |
| 24.01.2013 06:00 - 07:00 | 0 | 0 | 0 | 0 |
| 24.01.2013 07:00 - 08:00 | 0 | 0 | 0 | 0 |
| 24.01.2013 08:00 - 09:00 | 0 | 0 | 0 | 0 |
| 24.01.2013 09:00 - 10:00 | 0 | 0 | 0 | 0 |
| 24.01.2013 10:00 - 11:00 | 0 | 0 | 0 | 0 |
| 24.01.2013 11:00 - 12:00 | 0 | 0 | 0 | 0 |
| 24.01.2013 12:00 - 13:00 | 0 | 0 | 0 | 0 |
| 24.01.2013 13:00 - 14:00 | 0 | 0 | 0 | 0 |
| 24.01.2013 14:00 - 15:00 | 0 | 0 | 0 | 0 |
| 24.01.2013 15:00 - 16:00 | 0 | -200 | 0 | 0 |
| 24.01.2013 16:00 - 17:00 | 0 | -200 | 0 | 0 |
| 24.01.2013 17:00 - 18:00 | 0 | -400 | 0 | 0 |
| 24.01.2013 18:00 - 19:00 | 0 | -400 | 0 | 0 |
| 24.01.2013 19:00 - 20:00 | 0 | -400 | 0 | 0 |
| 24.01.2013 20:00 - 21:00 | 0 | -400 | 0 | 0 |
| 24.01.2013 21:00 - 22:00 | 0 | -400 | 0 | 0 |
| 24.01.2013 22:00 - 23:00 | 0 | -400 | 0 | 0 |
| 24.01.2013 23:00 - 24:00 | 0 | -400 | 0 | 0 |
| 25.01.2013 00:00 - 01:00 | 0 | -400 | 0 | 0 |
| 25.01.2013 01:00 - 02:00 | 0 | -400 | 0 | 0 |
| 25.01.2013 02:00 - 03:00 | 0 | -400 | 0 | 0 |
| 25.01.2013 03:00 - 04:00 | 0 | -400 | 0 | 0 |
| 25.01.2013 04:00 - 05:00 | 0 | -400 | 0 | 0 |
| 25.01.2013 05:00 - 06:00 | 0 | -400 | 0 | 0 |
| 25.01.2013 06:00 - 07:00 | 0 | 0 | 0 | 0 |
| 25.01.2013 07:00 - 08:00 | 0 | 0 | 0 | 0 |
| 25.01.2013 08:00 - 09:00 | 0 | 0 | 0 | 0 |
| 25.01.2013 09:00 - 10:00 | 0 | 0 | 0 | 0 |
| 25.01.2013 10:00 - 11:00 | 0 | 0 | 0 | 0 |
| 25.01.2013 11:00 - 12:00 | 0 | 0 | 0 | 0 |
| 25.01.2013 12:00 - 13:00 | 0 | 0 | 0 | 0 |
| 25.01.2013 13:00 - 14:00 | 0 | 0 | 0 | 0 |
| 25.01.2013 14:00 - 15:00 | 0 | -200 | 0 | 0 |
| 25.01.2013 15:00 - 16:00 | 0 | -200 | 0 | 0 |
| 25.01.2013 16:00 - 17:00 | 0 | -500 | 0 | 0 |
| 25.01.2013 17:00 - 18:00 | 0 | -500 | 0 | 0 |
| 25.01.2013 18:00 - 19:00 | 0 | -500 | 0 | 0 |
| 25.01.2013 19:00 - 20:00 | 0 | -500 | 0 | 0 |
| 25.01.2013 20:00 - 21:00 | 0 | -500 | 0 | 0 |
| 25.01.2013 21:00 - 22:00 | 0 | -500 | 0 | 0 |
| 25.01.2013 22:00 - 23:00 | 0 | -500 | 0 | 0 |
| 25.01.2013 23:00 - 24:00 | 0 | -500 | 0 | 0 |
| 26.01.2013 00:00 - 01:00 | 0 | -500 | 0 | 0 |
| 26.01.2013 01:00 - 02:00 | 0 | -500 | 0 | 0 |
| 26.01.2013 02:00 - 03:00 | 0 | -500 | 0 | 0 |
| 26.01.2013 03:00 - 04:00 | 0 | -500 | 0 | 0 |
| 26.01.2013 04:00 - 05:00 | 0 | -500 | 0 | 0 |
| 26.01.2013 05:00 - 06:00 | 0 | -500 | 0 | 0 |
| 26.01.2013 06:00 - 07:00 | 0 | 0 | 0 | 0 |
| 26.01.2013 07:00 - 08:00 | 0 | 0 | 0 | 0 |
| 26.01.2013 08:00 - 09:00 | 0 | 0 | 0 | 0 |
| 26.01.2013 09:00 - 10:00 | 0 | 0 | 0 | 0 |
| 26.01.2013 10:00 - 11:00 | 0 | 0 | 0 | 0 |
| 26.01.2013 11:00 - 12:00 | 0 | 0 | 0 | 0 |
| 26.01.2013 12:00 - 13:00 | 0 | 0 | 0 | 0 |
| 26.01.2013 13:00 - 14:00 | 0 | 0 | 0 | 0 |
| 26.01.2013 14:00 - 15:00 | 0 | 0 | 0 | 0 |
| 26.01.2013 15:00 - 16:00 | 0 | 0 | 0 | 0 |
| 26.01.2013 16:00 - 17:00 | 0 | 0 | 0 | 0 |
| 26.01.2013 17:00 - 18:00 | 0 | 0 | 0 | 0 |
| 26.01.2013 18:00 - 19:00 | 0 | 0 | 0 | 0 |
| 26.01.2013 19:00 - 20:00 | 0 | 0 | 0 | 0 |
| 26.01.2013 20:00 - 21:00 | 0 | 0 | 0 | 0 |
| 26.01.2013 21:00 - 22:00 | 0 | 0 | 0 | 0 |
| 26.01.2013 22:00 - 23:00 | 0 | 0 | 0 | 0 |
| 26.01.2013 23:00 - 24:00 | 0 | 0 | 0 | 0 |
| 27.01.2013 00:00 - 01:00 | 0 | 0 | 0 | 0 |
| 27.01.2013 01:00 - 02:00 | 0 | -400 | 0 | 0 |
| 27.01.2013 02:00 - 03:00 | 0 | -400 | 0 | 0 |
| 27.01.2013 03:00 - 04:00 | 0 | -1200 | 0 | 0 |
| 27.01.2013 04:00 - 05:00 | 0 | -1200 | 0 | 0 |
| 27.01.2013 05:00 - 06:00 | 0 | -1730 | 0 | 0 |
| 27.01.2013 06:00 - 07:00 | 0 | 0 | 0 | 0 |
| 27.01.2013 07:00 - 08:00 | 0 | 0 | 0 | 0 |
| 27.01.2013 08:00 - 09:00 | 0 | 0 | 0 | 0 |
| 27.01.2013 09:00 - 10:00 | 0 | 0 | 0 | 0 |
| 27.01.2013 10:00 - 11:00 | 0 | -300 | 0 | 0 |
| 27.01.2013 11:00 - 12:00 | 0 | -300 | 0 | 0 |
| 27.01.2013 12:00 - 13:00 | 0 | -300 | 0 | 0 |
| 27.01.2013 13:00 - 14:00 | 0 | -300 | 0 | 0 |
| 27.01.2013 14:00 - 15:00 | 0 | -300 | 0 | 0 |
| 27.01.2013 15:00 - 16:00 | 0 | -300 | 0 | 0 |
| 27.01.2013 16:00 - 17:00 | 0 | -300 | 0 | 0 |
| 27.01.2013 17:00 - 18:00 | 0 | -300 | 0 | 0 |
| 27.01.2013 18:00 - 19:00 | 0 | -300 | 0 | 0 |
| 27.01.2013 19:00 - 20:00 | 0 | -300 | 0 | 0 |
| 27.01.2013 20:00 - 21:00 | 0 | -300 | 0 | 0 |
| 27.01.2013 21:00 - 22:00 | 0 | -300 | 0 | 0 |
| 27.01.2013 22:00 - 23:00 | 0 | -300 | 0 | 0 |
| 27.01.2013 23:00 - 24:00 | 0 | -510 | 0 | 0 |
| 28.01.2013 00:00 - 01:00 | 0 | -710 | 0 | 0 |
| 28.01.2013 01:00 - 02:00 | 0 | -710 | 0 | 0 |
| 28.01.2013 02:00 - 03:00 | 0 | -710 | 0 | 0 |
| 28.01.2013 03:00 - 04:00 | 0 | -710 | 0 | 0 |
| 28.01.2013 04:00 - 05:00 | 0 | -980 | 0 | 0 |
| 28.01.2013 05:00 - 06:00 | 0 | -1040 | 0 | 0 |
| 28.01.2013 06:00 - 07:00 | 0 | 0 | 0 | 0 |
| 28.01.2013 07:00 - 08:00 | 0 | 0 | 0 | 0 |
| 28.01.2013 08:00 - 09:00 | 0 | 0 | 0 | 0 |
| 28.01.2013 09:00 - 10:00 | 0 | 0 | 0 | 0 |
| 28.01.2013 10:00 - 11:00 | 0 | 0 | 0 | 0 |
| 28.01.2013 11:00 - 12:00 | 0 | 0 | 0 | 0 |
| 28.01.2013 12:00 - 13:00 | 0 | 0 | 0 | 0 |
| 28.01.2013 13:00 - 14:00 | 0 | 0 | 0 | 0 |
| 28.01.2013 14:00 - 15:00 | 0 | 0 | 0 | 0 |
| 28.01.2013 15:00 - 16:00 | 0 | 0 | 0 | 0 |
| 28.01.2013 16:00 - 17:00 | 0 | 0 | 0 | 0 |
| 28.01.2013 17:00 - 18:00 | 0 | 0 | 0 | 0 |
| 28.01.2013 18:00 - 19:00 | 0 | -500 | 0 | 0 |
| 28.01.2013 19:00 - 20:00 | 0 | -500 | 0 | 0 |
| 28.01.2013 20:00 - 21:00 | 0 | -500 | 0 | 0 |
| 28.01.2013 21:00 - 22:00 | 0 | -500 | 0 | 0 |
| 28.01.2013 22:00 - 23:00 | 0 | -500 | 0 | 0 |
| 28.01.2013 23:00 - 24:00 | 0 | -1000 | 0 | 0 |
| 29.01.2013 00:00 - 01:00 | 0 | -1000 | 0 | 0 |
| 29.01.2013 01:00 - 02:00 | 0 | -1000 | 0 | 0 |
| 29.01.2013 02:00 - 03:00 | 0 | -1000 | 0 | 0 |
| 29.01.2013 03:00 - 04:00 | 0 | -1000 | 0 | 0 |
| 29.01.2013 04:00 - 05:00 | 0 | -1000 | 0 | 0 |
| 29.01.2013 05:00 - 06:00 | 0 | -1000 | 0 | 0 |
| 29.01.2013 06:00 - 07:00 | 0 | 0 | 0 | 0 |
| 29.01.2013 07:00 - 08:00 | 0 | 0 | 0 | 0 |
| 29.01.2013 08:00 - 09:00 | 0 | 0 | 0 | 0 |
| 29.01.2013 09:00 - 10:00 | 0 | 0 | 0 | 0 |
| 29.01.2013 10:00 - 11:00 | 0 | 0 | 0 | 0 |
| 29.01.2013 11:00 - 12:00 | 0 | 0 | 0 | 0 |
| 29.01.2013 12:00 - 13:00 | 0 | 0 | 0 | 0 |
| 29.01.2013 13:00 - 14:00 | 0 | 0 | 0 | 0 |
| 29.01.2013 14:00 - 15:00 | 0 | 0 | 0 | 0 |
| 29.01.2013 15:00 - 16:00 | 0 | 0 | 0 | 0 |
| 29.01.2013 16:00 - 17:00 | 0 | 0 | 0 | 0 |
| 29.01.2013 17:00 - 18:00 | 0 | 0 | 0 | 0 |
| 29.01.2013 18:00 - 19:00 | 0 | -300 | 0 | 0 |
| 29.01.2013 19:00 - 20:00 | 0 | -300 | 0 | 0 |
| 29.01.2013 20:00 - 21:00 | 0 | -300 | 0 | 0 |
| 29.01.2013 21:00 - 22:00 | 0 | -800 | 0 | 0 |
| 29.01.2013 22:00 - 23:00 | 0 | -800 | 0 | 0 |
| 29.01.2013 23:00 - 24:00 | 0 | -800 | 0 | 0 |
| 30.01.2013 00:00 - 01:00 | 0 | -1300 | 0 | 0 |
| 30.01.2013 01:00 - 02:00 | 0 | -1300 | 0 | 0 |
| 30.01.2013 02:00 - 03:00 | 0 | -1300 | 0 | 0 |
| 30.01.2013 03:00 - 04:00 | 0 | -1300 | 0 | 0 |
| 30.01.2013 04:00 - 05:00 | 0 | -1300 | 0 | 0 |
| 30.01.2013 05:00 - 06:00 | 0 | -1300 | 0 | 0 |
| 30.01.2013 06:00 - 07:00 | 0 | 0 | 0 | 0 |
| 30.01.2013 07:00 - 08:00 | 0 | 0 | 0 | 0 |
| 30.01.2013 08:00 - 09:00 | 0 | 0 | 0 | 0 |
| 30.01.2013 09:00 - 10:00 | 0 | 0 | 0 | 0 |
| 30.01.2013 10:00 - 11:00 | 0 | 0 | 0 | 0 |
| 30.01.2013 11:00 - 12:00 | 0 | 0 | 0 | 0 |
| 30.01.2013 12:00 - 13:00 | 0 | 0 | 0 | 0 |
| 30.01.2013 13:00 - 14:00 | 0 | 0 | 0 | 0 |
| 30.01.2013 14:00 - 15:00 | 0 | 0 | 0 | 0 |
| 30.01.2013 15:00 - 16:00 | 0 | -300 | 0 | 0 |
| 30.01.2013 16:00 - 17:00 | 0 | -300 | 0 | 0 |
| 30.01.2013 17:00 - 18:00 | 0 | -500 | 0 | 0 |
| 30.01.2013 18:00 - 19:00 | 0 | -500 | 0 | 0 |
| 30.01.2013 19:00 - 20:00 | 0 | -1000 | 0 | 0 |
| 30.01.2013 20:00 - 21:00 | 0 | -1000 | 0 | 0 |
| 30.01.2013 21:00 - 22:00 | 0 | -1000 | 0 | 0 |
| 30.01.2013 22:00 - 23:00 | 0 | -1000 | 0 | 0 |
| 30.01.2013 23:00 - 24:00 | 0 | -1000 | 0 | 0 |
| 31.01.2013 00:00 - 01:00 | 0 | -1000 | 0 | 0 |
| 31.01.2013 01:00 - 02:00 | 0 | -1000 | 0 | 0 |
| 31.01.2013 02:00 - 03:00 | 0 | -1000 | 0 | 0 |
| 31.01.2013 03:00 - 04:00 | 0 | -1000 | 0 | 0 |
| 31.01.2013 04:00 - 05:00 | 0 | -1000 | 0 | 0 |
| 31.01.2013 05:00 - 06:00 | 0 | -1000 | 0 | 0 |
| 31.01.2013 06:00 - 07:00 | 0 | 0 | 0 | 0 |
| 31.01.2013 07:00 - 08:00 | 0 | 0 | 0 | 0 |
| 31.01.2013 08:00 - 09:00 | 0 | 0 | 0 | 0 |
| 31.01.2013 09:00 - 10:00 | 0 | 0 | 0 | 0 |
| 31.01.2013 10:00 - 11:00 | 0 | 0 | 0 | 0 |
| 31.01.2013 11:00 - 12:00 | 0 | 0 | 0 | 0 |
| 31.01.2013 12:00 - 13:00 | 0 | 0 | 0 | 0 |
| 31.01.2013 13:00 - 14:00 | 0 | 0 | 0 | 0 |
| 31.01.2013 14:00 - 15:00 | 0 | -400 | 0 | 0 |
| 31.01.2013 15:00 - 16:00 | 0 | -400 | 0 | 0 |
| 31.01.2013 16:00 - 17:00 | 0 | -400 | 0 | 0 |
| 31.01.2013 17:00 - 18:00 | 0 | -900 | 0 | 0 |
| 31.01.2013 18:00 - 19:00 | 0 | -900 | 0 | 0 |
| 31.01.2013 19:00 - 20:00 | 0 | -900 | 0 | 0 |
| 31.01.2013 20:00 - 21:00 | 0 | -900 | 0 | 0 |
| 31.01.2013 21:00 - 22:00 | 0 | -900 | 0 | 0 |
| 31.01.2013 22:00 - 23:00 | 0 | -900 | 0 | 0 |
| 31.01.2013 23:00 - 24:00 | 0 | -900 | 0 | 0 |
| 01.02.2013 00:00 - 01:00 | 0 | -900 | 0 | 0 |
| 01.02.2013 01:00 - 02:00 | 0 | -900 | 0 | 0 |
| 01.02.2013 02:00 - 03:00 | 0 | -900 | 0 | 0 |
| 01.02.2013 03:00 - 04:00 | 0 | -900 | 0 | 0 |
| 01.02.2013 04:00 - 05:00 | 0 | -900 | 0 | 0 |
| 01.02.2013 05:00 - 06:00 | 0 | -900 | 0 | 0 |